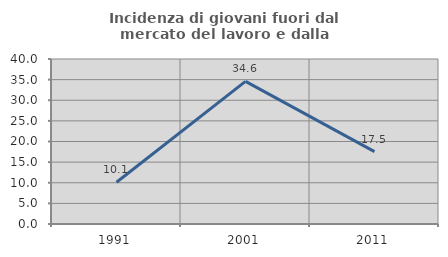
| Category | Incidenza di giovani fuori dal mercato del lavoro e dalla formazione  |
|---|---|
| 1991.0 | 10.127 |
| 2001.0 | 34.568 |
| 2011.0 | 17.544 |